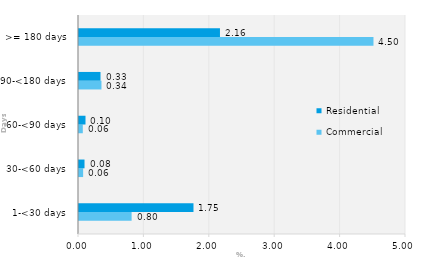
| Category | Commercial | Residential |
|---|---|---|
| 1-<30 days | 0.804 | 1.75 |
| 30-<60 days | 0.063 | 0.084 |
| 60-<90 days | 0.058 | 0.099 |
| 90-<180 days | 0.343 | 0.329 |
| >= 180 days | 4.503 | 2.155 |